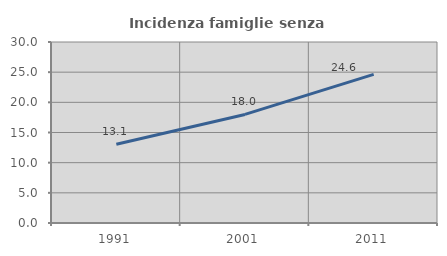
| Category | Incidenza famiglie senza nuclei |
|---|---|
| 1991.0 | 13.064 |
| 2001.0 | 17.994 |
| 2011.0 | 24.635 |